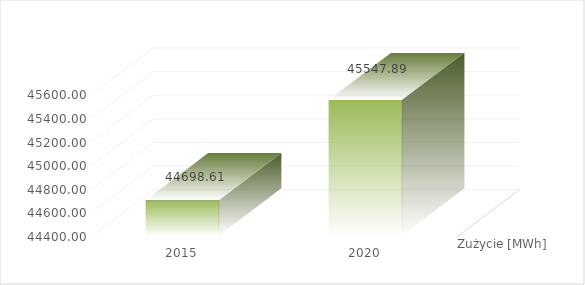
| Category | Zużycie [MWh] |
|---|---|
| 2015.0 | 44698.612 |
| 2020.0 | 45547.886 |